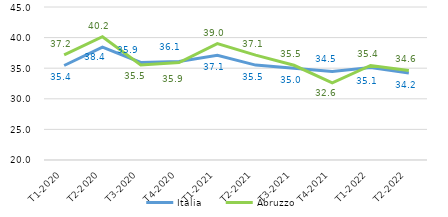
| Category | Italia | Abruzzo |
|---|---|---|
|   T1-2020 | 35.444 | 37.162 |
|   T2-2020 | 38.431 | 40.15 |
|   T3-2020 | 35.938 | 35.527 |
|   T4-2020 | 36.104 | 35.935 |
|   T1-2021 | 37.107 | 39.023 |
|   T2-2021 | 35.509 | 37.138 |
|   T3-2021 | 34.983 | 35.478 |
|   T4-2021 | 34.464 | 32.62 |
|   T1-2022 | 35.127 | 35.444 |
|   T2-2022 | 34.205 | 34.625 |